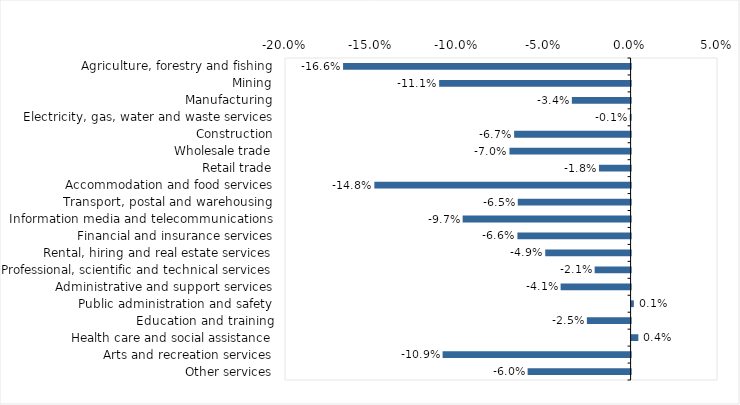
| Category | This week |
|---|---|
| Agriculture, forestry and fishing | -0.166 |
| Mining | -0.111 |
| Manufacturing | -0.034 |
| Electricity, gas, water and waste services | 0 |
| Construction | -0.067 |
| Wholesale trade | -0.07 |
| Retail trade | -0.018 |
| Accommodation and food services | -0.148 |
| Transport, postal and warehousing | -0.065 |
| Information media and telecommunications | -0.097 |
| Financial and insurance services | -0.066 |
| Rental, hiring and real estate services | -0.049 |
| Professional, scientific and technical services | -0.021 |
| Administrative and support services | -0.04 |
| Public administration and safety | 0.001 |
| Education and training | -0.025 |
| Health care and social assistance | 0.004 |
| Arts and recreation services | -0.109 |
| Other services | -0.06 |